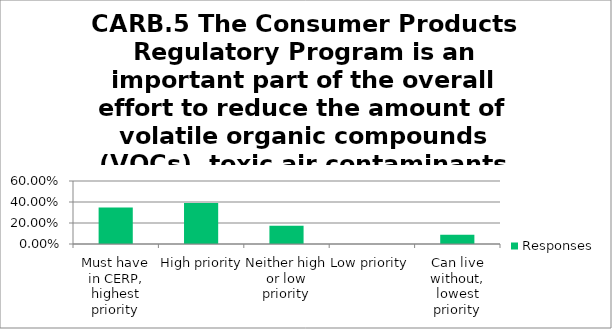
| Category | Responses |
|---|---|
| Must have in CERP, highest priority | 0.348 |
| High priority | 0.391 |
| Neither high or low priority | 0.174 |
| Low priority | 0 |
| Can live without, lowest priority | 0.087 |